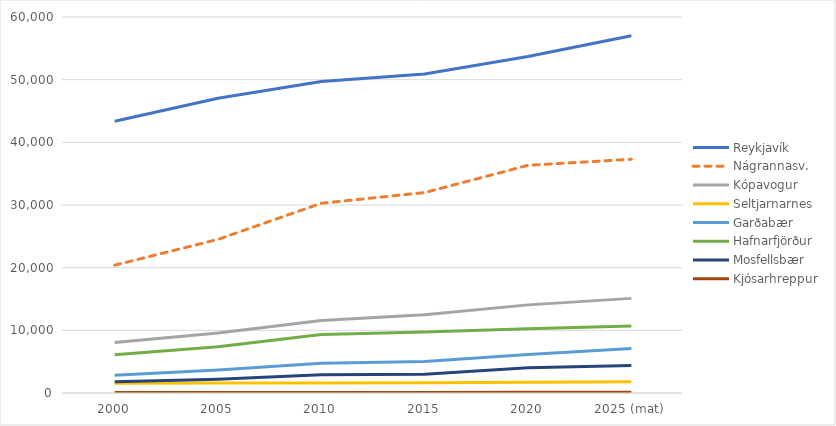
| Category | Reykjavík | Nágrannasv. | Kópavogur | Seltjarnarnes | Garðabær | Hafnarfjörður | Mosfellsbær | Kjósarhreppur |
|---|---|---|---|---|---|---|---|---|
| 2000 | 43365 | 20395 | 8052 | 1563 | 2832 | 6103 | 1776 | 69 |
| 2005 | 47036 | 24513 | 9582 | 1590 | 3666 | 7396 | 2205 | 74 |
| 2010 | 49721 | 30279 | 11563 | 1615 | 4766 | 9342 | 2899 | 94 |
| 2015 | 50896 | 31983 | 12496 | 1646 | 5013 | 9733 | 2999 | 96 |
| 2020 | 53700 | 36333 | 14063 | 1727 | 6149 | 10255 | 4035 | 104 |
| 2025 (mat) | 57000 | 37300 | 15100 | 1800 | 7100 | 10700 | 4400 | 100 |